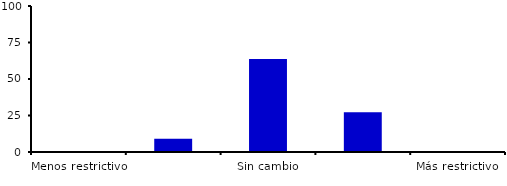
| Category | Series 0 |
|---|---|
| Menos restrictivo | 0 |
| Moderadamente menos restrictivo | 9.091 |
| Sin cambio | 63.636 |
| Moderadamente más restrictivo | 27.273 |
| Más restrictivo | 0 |